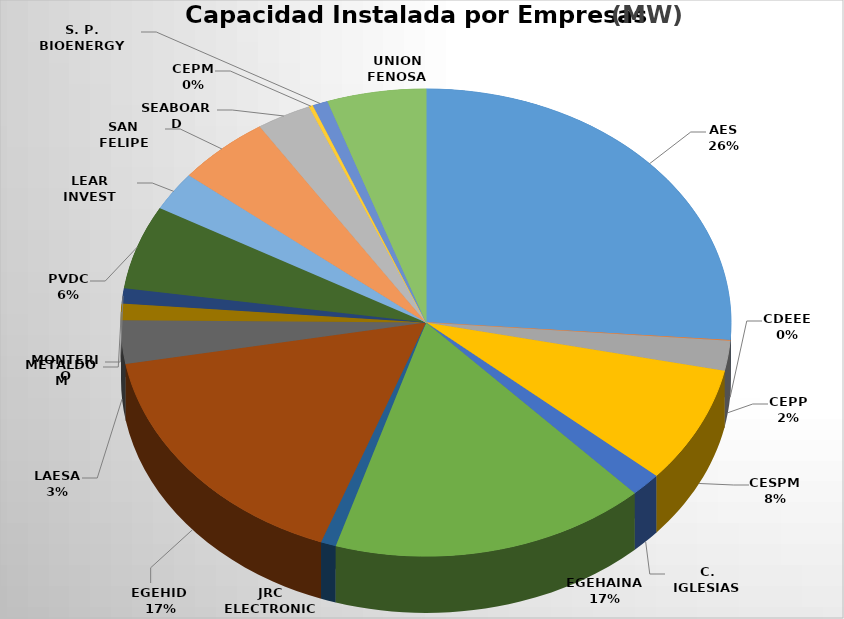
| Category | Potencia     (MW) | % |
|---|---|---|
| AES | 972.5 | 0.262 |
| CDEEE | 1.9 | 0.001 |
| CEPP | 76.8 | 0.021 |
| CESPM | 300 | 0.081 |
| C. IGLESIAS | 60.69 | 0.016 |
| EGEHAINA  | 622.25 | 0.168 |
| JRC ELECTRONIC | 30 | 0.008 |
| EGEHID  | 615.72 | 0.166 |
| LAESA | 111.2 | 0.03 |
| METALDOM | 42 | 0.011 |
| MONTERIO | 39.4 | 0.011 |
| PVDC | 215.1 | 0.058 |
| LEAR INVEST | 100.1 | 0.027 |
| SAN FELIPE | 185 | 0.05 |
| SEABOARD | 108 | 0.029 |
| CEPM | 8.25 | 0.002 |
| S. P. BIOENERGY | 30 | 0.008 |
| UNION FENOSA | 194.5 | 0.052 |